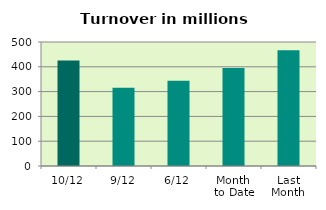
| Category | Series 0 |
|---|---|
| 10/12 | 425.71 |
| 9/12 | 315.829 |
| 6/12 | 343.869 |
| Month 
to Date | 394.706 |
| Last
Month | 466.544 |